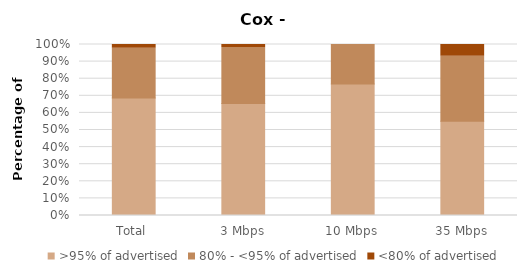
| Category | >95% of advertised | 80% - <95% of advertised | <80% of advertised |
|---|---|---|---|
| Total | 0.687 | 0.291 | 0.022 |
| 3 Mbps | 0.655 | 0.327 | 0.018 |
| 10 Mbps | 0.769 | 0.231 | 0 |
| 35 Mbps | 0.552 | 0.379 | 0.069 |